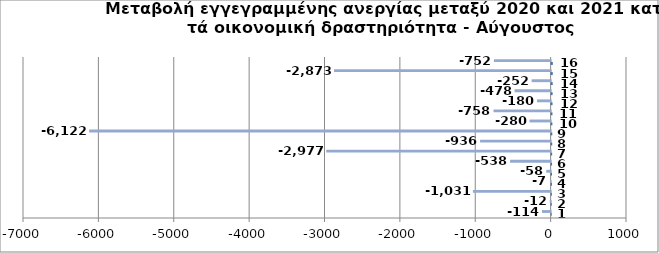
| Category | Series 0 | Series 1 |
|---|---|---|
| 0 | 1 | -114 |
| 1 | 2 | -12 |
| 2 | 3 | -1031 |
| 3 | 4 | -7 |
| 4 | 5 | -58 |
| 5 | 6 | -538 |
| 6 | 7 | -2977 |
| 7 | 8 | -936 |
| 8 | 9 | -6122 |
| 9 | 10 | -280 |
| 10 | 11 | -758 |
| 11 | 12 | -180 |
| 12 | 13 | -478 |
| 13 | 14 | -252 |
| 14 | 15 | -2873 |
| 15 | 16 | -752 |